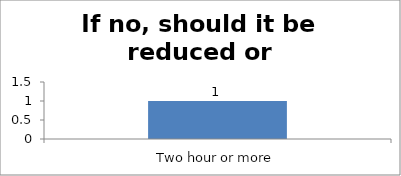
| Category | If no, should it be reduced or increased: |
|---|---|
| Two hour or more | 1 |